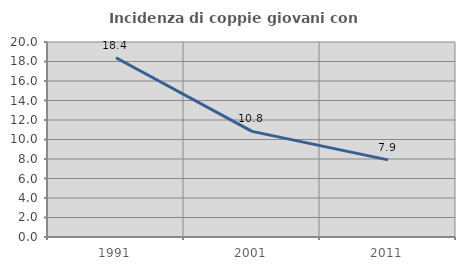
| Category | Incidenza di coppie giovani con figli |
|---|---|
| 1991.0 | 18.38 |
| 2001.0 | 10.835 |
| 2011.0 | 7.909 |